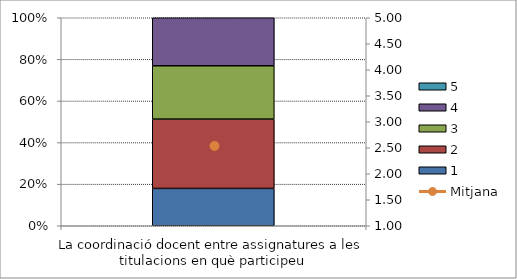
| Category | 1 | 2 | 3 | 4 | 5 |
|---|---|---|---|---|---|
| La coordinació docent entre assignatures a les titulacions en què participeu | 7 | 13 | 10 | 9 | 0 |